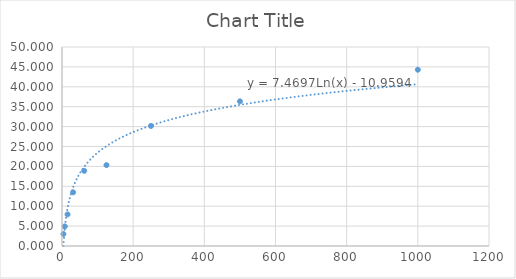
| Category | Series 0 |
|---|---|
| 3.91 | 3.016 |
| 7.81 | 4.921 |
| 15.62 | 7.937 |
| 31.25 | 13.492 |
| 62.5 | 18.889 |
| 125.0 | 20.317 |
| 250.0 | 30.159 |
| 500.0 | 36.349 |
| 1000.0 | 44.286 |